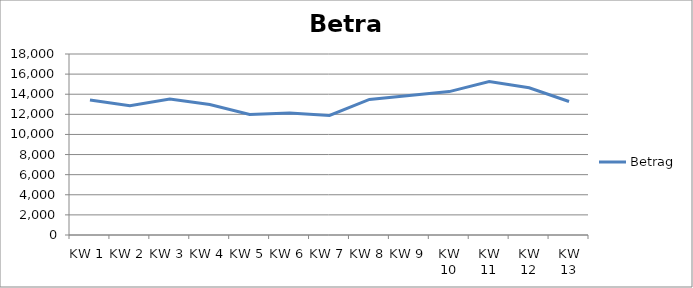
| Category | Betrag |
|---|---|
| KW 1 | 13420 |
| KW 2 | 12860 |
| KW 3 | 13530 |
| KW 4 | 12970 |
| KW 5 | 11980 |
| KW 6 | 12140 |
| KW 7 | 11890 |
| KW 8 | 13480 |
| KW 9 | 13870 |
| KW 10 | 14260 |
| KW 11 | 15270 |
| KW 12 | 14645 |
| KW 13 | 13275 |